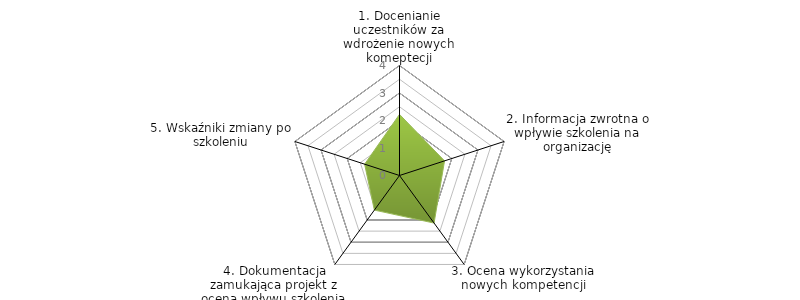
| Category | Series 0 | BENCHMARK |
|---|---|---|
| 1. Docenianie uczestników za wdrożenie nowych komeptecji |  | 2.222 |
| 2. Informacja zwrotna o wpływie szkolenia na organizację |  | 1.722 |
| 3. Ocena wykorzystania nowych kompetencji |  | 2.139 |
| 4. Dokumentacja zamukająca projekt z oceną wpływu szkolenia |  | 1.556 |
| 5. Wskaźniki zmiany po szkoleniu |  | 1.333 |